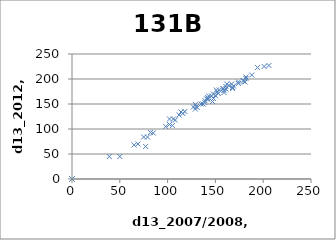
| Category | Series 0 |
|---|---|
| 130.0 | 145 |
| 129.0 | 140 |
| 174.0 | 191 |
| 118.0 | 135 |
| 147.0 | 155 |
| 169.0 | 186 |
| 0.0 | 0 |
| 179.0 | 197 |
| 148.0 | 161 |
| 188.0 | 208 |
| 0.0 | 0 |
| 154.0 | 178 |
| 127.0 | 144 |
| 106.0 | 120 |
| 150.0 | 167 |
| 151.0 | 178 |
| 148.0 | 170 |
| 98.0 | 105 |
| 180.0 | 195 |
| 159.0 | 177 |
| 102.0 | 120 |
| 0.0 | 0 |
| 142.0 | 160 |
| 143.0 | 166 |
| 137.0 | 150 |
| 167.0 | 190 |
| 139.0 | 153 |
| 201.0 | 225 |
| 0.0 | 0 |
| 159.0 | 173 |
| 142.0 | 163 |
| 161.0 | 185 |
| 0.0 | 0 |
| 158.0 | 180 |
| 0.0 | 0 |
| 164.0 | 187 |
| 168.0 | 183 |
| 135.0 | 150 |
| 129.0 | 149 |
| 108.0 | 118 |
| 116.0 | 131 |
| 152.0 | 174 |
| 161.0 | 180 |
| 0.0 | 0 |
| 112.0 | 128 |
| 114.0 | 134 |
| 141.0 | 160 |
| 153.0 | 171 |
| 158.0 | 181 |
| 131.0 | 143 |
| 139.0 | 157 |
| 174.0 | 194 |
| 168.0 | 181 |
| 182.0 | 204 |
| 146.0 | 166 |
| 162.0 | 190 |
| 206.0 | 227 |
| 194.0 | 223 |
| 182.0 | 201 |
| 181.0 | 194 |
| 0.0 | 0 |
| 77.0 | 65 |
| 79.0 | 84 |
| 0.0 | 0 |
| 0.0 | 0 |
| 82.0 | 93 |
| 0.0 | 0 |
| 50.0 | 45 |
| 39.0 | 45 |
| 0.0 | 0 |
| 0.0 | 0 |
| 65.0 | 68 |
| 0.0 | 0 |
| 0.0 | 0 |
| 105.0 | 107 |
| 0.0 | 0 |
| 0.0 | 0 |
| 85.0 | 92 |
| 102.0 | 109 |
| 0.0 | 0 |
| 0.0 | 0 |
| 75.0 | 84 |
| 0.0 | 0 |
| 69.0 | 70 |
| 0.0 | 0 |
| 0.0 | 0 |
| 0.0 | 0 |
| 0.0 | 0 |